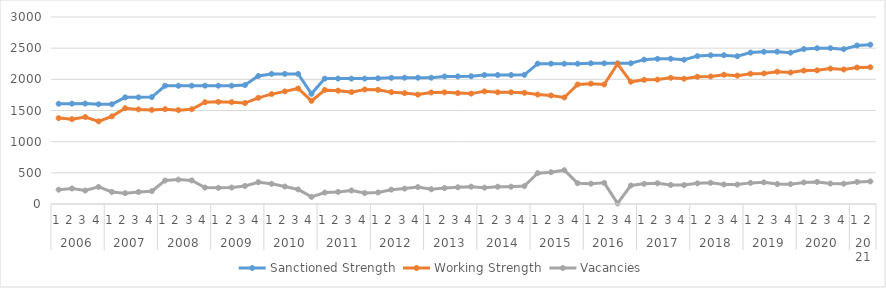
| Category | Sanctioned Strength | Working Strength | Vacancies |
|---|---|---|---|
| 0 | 1608 | 1378 | 230 |
| 1 | 1610 | 1361 | 249 |
| 2 | 1611 | 1395 | 216 |
| 3 | 1600 | 1326 | 274 |
| 4 | 1600 | 1406 | 194 |
| 5 | 1711 | 1537 | 174 |
| 6 | 1711 | 1518 | 193 |
| 7 | 1715 | 1509 | 206 |
| 8 | 1897 | 1521 | 376 |
| 9 | 1897 | 1506 | 391 |
| 10 | 1898 | 1520 | 378 |
| 11 | 1898 | 1634 | 264 |
| 12 | 1898 | 1639 | 259 |
| 13 | 1898 | 1634 | 264 |
| 14 | 1908 | 1619 | 289 |
| 15 | 2053 | 1703 | 350 |
| 16 | 2087 | 1763 | 324 |
| 17 | 2087 | 1807 | 280 |
| 18 | 2087 | 1853 | 234 |
| 19 | 1768 | 1654 | 114 |
| 20 | 2012 | 1829 | 183 |
| 21 | 2012 | 1818 | 194 |
| 22 | 2012 | 1795 | 217 |
| 23 | 2012 | 1837 | 175 |
| 24 | 2016 | 1831 | 185 |
| 25 | 2024 | 1794 | 230 |
| 26 | 2026 | 1779 | 247 |
| 27 | 2026 | 1755 | 271 |
| 28 | 2026 | 1789 | 237 |
| 29 | 2046 | 1791 | 255 |
| 30 | 2047 | 1779 | 268 |
| 31 | 2049 | 1771 | 278 |
| 32 | 2069 | 1807 | 262 |
| 33 | 2069 | 1792 | 277 |
| 34 | 2069 | 1792 | 277 |
| 35 | 2072 | 1784 | 288 |
| 36 | 2251 | 1756 | 495 |
| 37 | 2251 | 1741 | 510 |
| 38 | 2251 | 1709 | 542 |
| 39 | 2251 | 1917 | 334 |
| 40 | 2257 | 1931 | 326 |
| 41 | 2257 | 1918 | 339 |
| 42 | 2257 | 2248 | 9 |
| 43 | 2257.093 | 1960.68 | 296.413 |
| 44 | 2315.756 | 1991.833 | 323.924 |
| 45 | 2328.575 | 1996.287 | 332.287 |
| 46 | 2329.938 | 2024.287 | 305.651 |
| 47 | 2313.947 | 2010.076 | 303.87 |
| 48 | 2372.61 | 2041.229 | 331.381 |
| 49 | 2385.428 | 2045.684 | 339.744 |
| 50 | 2386.792 | 2073.684 | 313.108 |
| 51 | 2370.8 | 2059.473 | 311.327 |
| 52 | 2429.463 | 2090.625 | 338.838 |
| 53 | 2442.281 | 2095.08 | 347.201 |
| 54 | 2443.645 | 2123.08 | 320.565 |
| 55 | 2427.653 | 2108.869 | 318.784 |
| 56 | 2486.316 | 2140.022 | 346.295 |
| 57 | 2499.135 | 2144.476 | 354.658 |
| 58 | 2500.498 | 2172.476 | 328.022 |
| 59 | 2484.507 | 2158.265 | 326.241 |
| 60 | 2543.17 | 2189.418 | 353.752 |
| 61 | 2555.988 | 2193.873 | 362.115 |